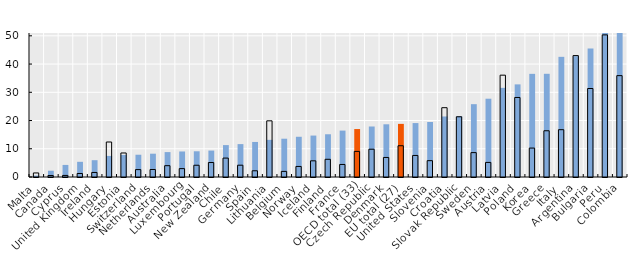
| Category | Foreign-born | Native-born |
|---|---|---|
| Malta | 0.492 | 1.436 |
| Canada | 2.226 | 0.532 |
| Cyprus | 4.274 | 0.557 |
| United Kingdom | 5.379 | 1.241 |
| Ireland | 5.954 | 1.608 |
| Hungary | 7.461 | 12.393 |
| Estonia | 7.813 | 8.509 |
| Switzerland | 7.888 | 2.619 |
| Netherlands | 8.253 | 2.659 |
| Australia | 8.821 | 4.007 |
| Luxembourg | 9.041 | 2.969 |
| Portugal | 9.111 | 4.164 |
| New Zealand | 9.365 | 5.127 |
| Chile | 11.3 | 6.7 |
| Germany | 11.652 | 4.183 |
| Spain | 12.412 | 2.206 |
| Lithuania | 13.155 | 19.899 |
| Belgium | 13.562 | 1.991 |
| Norway | 14.249 | 3.739 |
| Iceland | 14.674 | 5.733 |
| Finland | 15.135 | 6.273 |
| France | 16.437 | 4.438 |
| OECD total (33) | 16.982 | 9.068 |
| Czech Republic | 17.887 | 9.834 |
| Denmark | 18.668 | 6.921 |
| EU total (27) | 18.813 | 11.068 |
| United States | 19.1 | 7.63 |
| Slovenia | 19.487 | 5.784 |
| Croatia | 21.433 | 24.545 |
| Slovak Republic | 21.528 | 21.33 |
| Sweden | 25.794 | 8.637 |
| Austria | 27.728 | 5.166 |
| Latvia | 31.575 | 36.069 |
| Poland | 32.802 | 28.165 |
| Korea | 36.534 | 10.246 |
| Greece | 36.555 | 16.378 |
| Italy | 42.558 | 16.756 |
| Argentina | 42.8 | 43 |
| Bulgaria | 45.535 | 31.339 |
| Peru | 61.218 | 50.332 |
| Colombia | 69.2 | 35.9 |